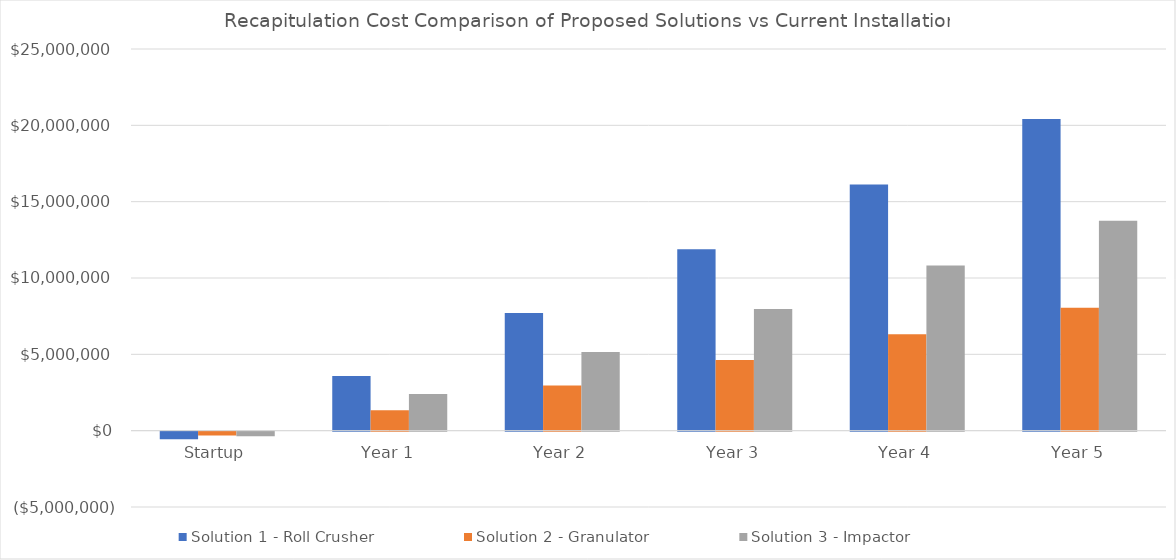
| Category | Solution 1 - Roll Crusher | Solution 2 - Granulator | Solution 3 - Impactor |
|---|---|---|---|
| Startup | -500000 | -250000 | -300000 |
| Year 1 | 3576287 | 1340717 | 2401719 |
| Year 2 | 7705444 | 2965642 | 5156308 |
| Year 3 | 11887999 | 4625210 | 7964295 |
| Year 4 | 16124486 | 6319862 | 10826214 |
| Year 5 | 20415446 | 8050043 | 13742606 |